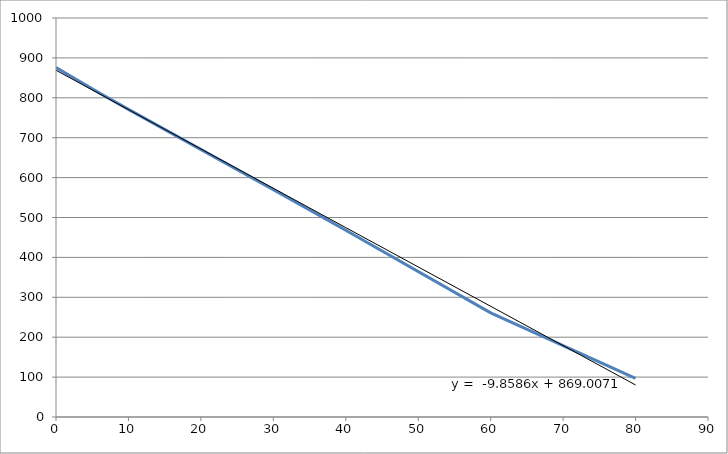
| Category | Series 0 |
|---|---|
| 0.0 | 876 |
| 6.0 | 812 |
| 10.0 | 771 |
| 30.0 | 570 |
| 40.0 | 468 |
| 60.0 | 261 |
| 80.0 | 97 |